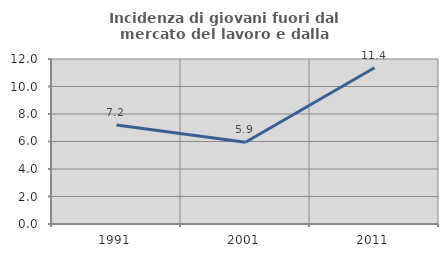
| Category | Incidenza di giovani fuori dal mercato del lavoro e dalla formazione  |
|---|---|
| 1991.0 | 7.204 |
| 2001.0 | 5.945 |
| 2011.0 | 11.364 |